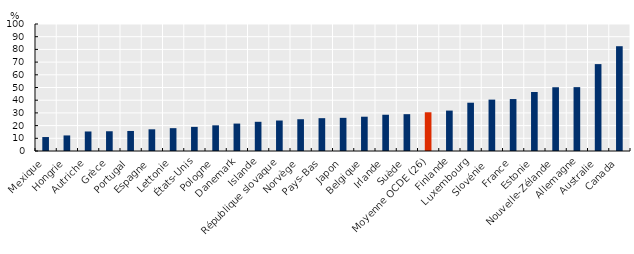
| Category | Series 0 |
|---|---|
| Mexique | 11 |
| Hongrie | 12.257 |
| Autriche | 15.375 |
| Grèce | 15.546 |
| Portugal | 15.78 |
| Espagne | 17.087 |
| Lettonie | 17.986 |
| États-Unis | 19 |
| Pologne | 20.213 |
| Danemark | 21.597 |
| Islande | 22.994 |
| République slovaque | 24 |
| Norvège | 25.024 |
| Pays-Bas | 25.855 |
| Japon | 26.105 |
| Belgique | 27 |
| Irlande | 28.545 |
| Suède | 29 |
| Moyenne OCDE (26) | 30.499 |
| Finlande | 31.82 |
| Luxembourg | 38.024 |
| Slovénie  | 40.463 |
| France | 40.909 |
| Estonie | 46.479 |
| Nouvelle-Zélande | 50.203 |
| Allemagne | 50.286 |
| Australie | 68.422 |
| Canada | 82.505 |